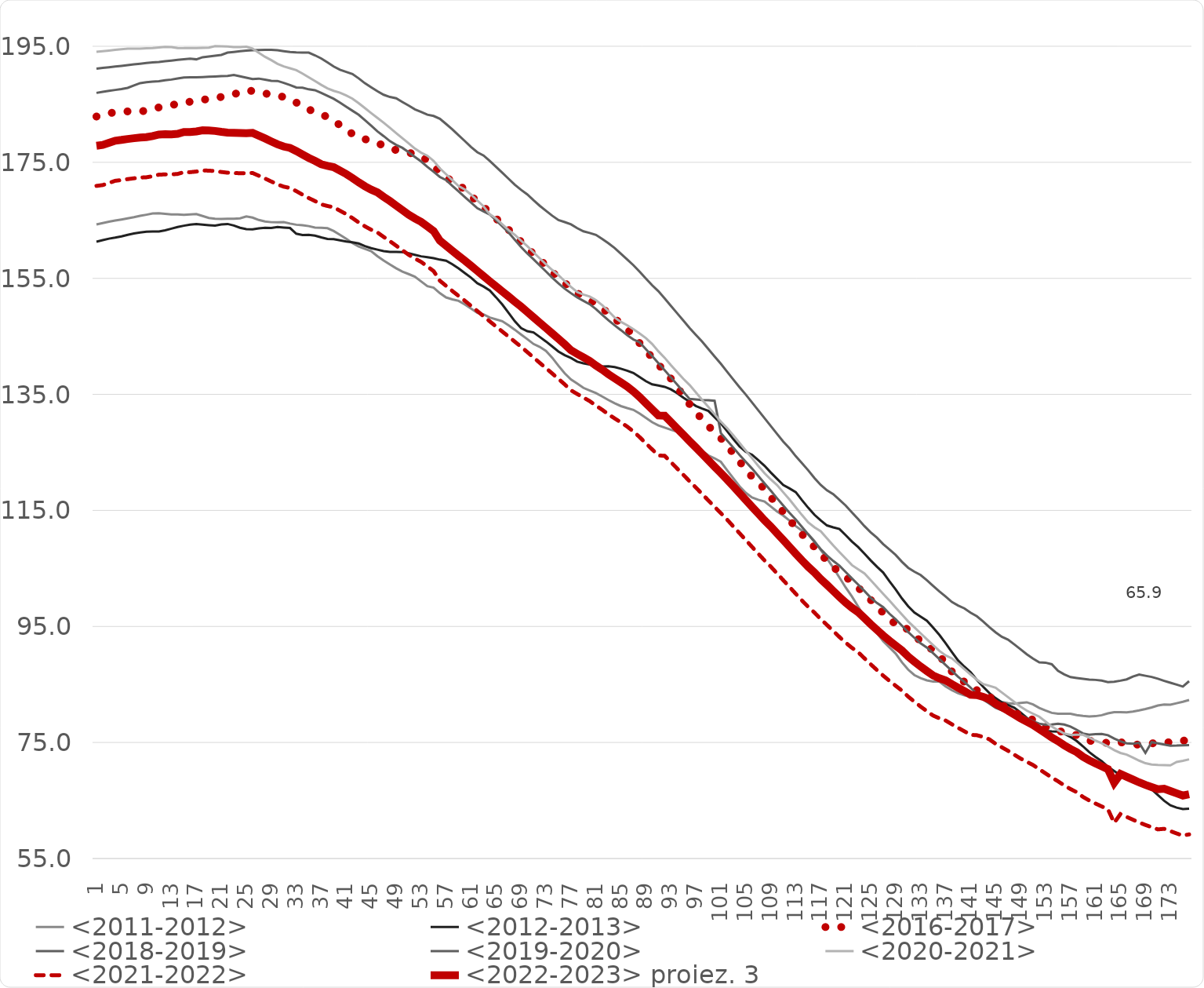
| Category | <2011-2012> | <2012-2013> | <2016-2017> | <2018-2019> | <2019-2020> | <2020-2021> | <2021-2022> | <2022-2023> proiez. 3 |
|---|---|---|---|---|---|---|---|---|
| 1.0 | 164.28 | 161.325 | 182.89 | 186.966 | 191.146 | 194.044 | 170.933 | 177.846 |
| 2.0 | 164.523 | 161.574 | 183.183 | 187.153 | 191.28 | 194.151 | 171.078 | 177.992 |
| 3.0 | 164.768 | 161.839 | 183.434 | 187.307 | 191.392 | 194.264 | 171.438 | 178.352 |
| 4.0 | 164.958 | 162.014 | 183.638 | 187.474 | 191.501 | 194.377 | 171.813 | 178.727 |
| 5.0 | 165.149 | 162.228 | 183.717 | 187.626 | 191.621 | 194.494 | 171.944 | 178.858 |
| 6.0 | 165.348 | 162.505 | 183.777 | 187.833 | 191.754 | 194.574 | 172.102 | 179.016 |
| 7.0 | 165.545 | 162.725 | 183.762 | 188.248 | 191.89 | 194.576 | 172.243 | 179.157 |
| 8.0 | 165.768 | 162.892 | 183.729 | 188.643 | 192 | 194.606 | 172.367 | 179.281 |
| 9.0 | 165.968 | 163.041 | 183.946 | 188.816 | 192.115 | 194.661 | 172.42 | 179.334 |
| 10.0 | 166.179 | 163.072 | 184.252 | 188.909 | 192.208 | 194.707 | 172.601 | 179.515 |
| 11.0 | 166.21 | 163.081 | 184.461 | 188.983 | 192.298 | 194.791 | 172.871 | 179.785 |
| 12.0 | 166.105 | 163.273 | 184.693 | 189.134 | 192.412 | 194.88 | 172.916 | 179.83 |
| 13.0 | 166.006 | 163.557 | 184.886 | 189.262 | 192.533 | 194.863 | 172.911 | 179.825 |
| 14.0 | 166.005 | 163.846 | 185.021 | 189.452 | 192.666 | 194.698 | 172.997 | 179.911 |
| 15.0 | 165.96 | 164.072 | 185.181 | 189.617 | 192.762 | 194.674 | 173.305 | 180.219 |
| 16.0 | 166.032 | 164.247 | 185.448 | 189.659 | 192.877 | 194.675 | 173.301 | 180.215 |
| 17.0 | 166.08 | 164.347 | 185.707 | 189.659 | 192.749 | 194.69 | 173.409 | 180.322 |
| 18.0 | 165.748 | 164.248 | 185.811 | 189.694 | 193.116 | 194.725 | 173.6 | 180.514 |
| 19.0 | 165.401 | 164.161 | 185.869 | 189.741 | 193.241 | 194.762 | 173.563 | 180.477 |
| 20.0 | 165.276 | 164.094 | 186.018 | 189.785 | 193.375 | 195.014 | 173.49 | 180.404 |
| 21.0 | 165.24 | 164.282 | 186.276 | 189.839 | 193.51 | 194.983 | 173.335 | 180.249 |
| 22.0 | 165.259 | 164.372 | 186.39 | 189.89 | 193.906 | 194.946 | 173.207 | 180.121 |
| 23.0 | 165.278 | 164.101 | 186.736 | 190.044 | 194.019 | 194.876 | 173.155 | 180.069 |
| 24.0 | 165.334 | 163.72 | 187.044 | 189.81 | 194.139 | 194.875 | 173.121 | 180.035 |
| 25.0 | 165.681 | 163.473 | 187.403 | 189.578 | 194.251 | 194.927 | 173.108 | 180.022 |
| 26.0 | 165.472 | 163.458 | 187.287 | 189.344 | 194.304 | 194.594 | 173.16 | 180.074 |
| 27.0 | 165.06 | 163.628 | 187.195 | 189.431 | 194.346 | 193.894 | 172.685 | 179.599 |
| 28.0 | 164.8 | 163.709 | 186.89 | 189.239 | 194.395 | 193.186 | 172.202 | 179.116 |
| 29.0 | 164.68 | 163.679 | 186.606 | 189.053 | 194.382 | 192.605 | 171.691 | 178.605 |
| 30.0 | 164.662 | 163.84 | 186.442 | 189.021 | 194.306 | 191.974 | 171.193 | 178.107 |
| 31.0 | 164.696 | 163.753 | 186.273 | 188.699 | 194.157 | 191.521 | 170.798 | 177.712 |
| 32.0 | 164.442 | 163.674 | 185.771 | 188.309 | 194.023 | 191.207 | 170.576 | 177.49 |
| 33.0 | 164.24 | 162.689 | 185.302 | 187.895 | 193.942 | 190.887 | 170.035 | 176.949 |
| 34.0 | 164.159 | 162.475 | 184.726 | 187.86 | 193.903 | 190.303 | 169.423 | 176.337 |
| 35.0 | 164.002 | 162.482 | 184.146 | 187.577 | 193.897 | 189.646 | 168.84 | 175.753 |
| 36.0 | 163.765 | 162.363 | 183.583 | 187.423 | 193.438 | 189.003 | 168.324 | 175.237 |
| 37.0 | 163.701 | 162.056 | 183.211 | 186.962 | 192.899 | 188.35 | 167.755 | 174.669 |
| 38.0 | 163.642 | 161.787 | 182.843 | 186.45 | 192.214 | 187.744 | 167.47 | 174.384 |
| 39.0 | 163.148 | 161.744 | 182.125 | 185.941 | 191.507 | 187.32 | 167.248 | 174.162 |
| 40.0 | 162.507 | 161.55 | 181.415 | 185.28 | 190.949 | 187.009 | 166.657 | 173.57 |
| 41.0 | 161.822 | 161.341 | 180.646 | 184.568 | 190.579 | 186.522 | 166.07 | 172.984 |
| 42.0 | 161.073 | 161.212 | 179.88 | 183.888 | 190.211 | 185.963 | 165.386 | 172.3 |
| 43.0 | 160.49 | 161.002 | 179.277 | 183.19 | 189.465 | 185.195 | 164.635 | 171.549 |
| 44.0 | 160.07 | 160.555 | 178.976 | 182.258 | 188.629 | 184.34 | 163.963 | 170.877 |
| 45.0 | 159.669 | 160.195 | 178.774 | 181.303 | 187.926 | 183.485 | 163.377 | 170.291 |
| 46.0 | 158.816 | 159.941 | 178.288 | 180.341 | 187.252 | 182.661 | 162.91 | 169.824 |
| 47.0 | 158.058 | 159.703 | 177.902 | 179.514 | 186.639 | 181.825 | 162.14 | 169.054 |
| 48.0 | 157.385 | 159.564 | 177.493 | 178.645 | 186.262 | 180.936 | 161.408 | 168.322 |
| 49.0 | 156.729 | 159.558 | 177.1 | 178.012 | 186.032 | 180.042 | 160.629 | 167.543 |
| 50.0 | 156.154 | 159.525 | 176.803 | 177.492 | 185.393 | 179.156 | 159.848 | 166.761 |
| 51.0 | 155.738 | 159.333 | 176.634 | 176.728 | 184.775 | 178.262 | 159.065 | 165.979 |
| 52.0 | 155.297 | 159.06 | 176.458 | 175.923 | 184.128 | 177.368 | 158.416 | 165.33 |
| 53.0 | 154.462 | 158.796 | 176.08 | 175.14 | 183.698 | 176.654 | 157.835 | 164.749 |
| 54.0 | 153.648 | 158.656 | 175.319 | 174.218 | 183.211 | 176.136 | 157.044 | 163.958 |
| 55.0 | 153.394 | 158.472 | 174.332 | 173.363 | 182.986 | 175.252 | 156.245 | 163.159 |
| 56.0 | 152.44 | 158.224 | 173.32 | 172.474 | 182.497 | 173.957 | 154.587 | 161.501 |
| 57.0 | 151.708 | 158.039 | 172.376 | 171.93 | 181.602 | 172.946 | 153.699 | 160.613 |
| 58.0 | 151.371 | 157.429 | 171.735 | 170.924 | 180.675 | 171.925 | 152.817 | 159.731 |
| 59.0 | 151.118 | 156.706 | 171.193 | 169.997 | 179.667 | 170.903 | 151.973 | 158.887 |
| 60.0 | 150.496 | 155.915 | 170.25 | 169.017 | 178.66 | 170.308 | 151.138 | 158.052 |
| 61.0 | 149.787 | 155.105 | 169.221 | 168.064 | 177.642 | 169.436 | 150.25 | 157.164 |
| 62.0 | 149.055 | 154.155 | 168.177 | 167.082 | 176.739 | 168.419 | 149.364 | 156.278 |
| 63.0 | 148.783 | 153.588 | 167.304 | 166.532 | 176.172 | 167.404 | 148.472 | 155.386 |
| 64.0 | 148.249 | 152.91 | 166.292 | 165.994 | 175.228 | 166.036 | 147.575 | 154.489 |
| 65.0 | 147.932 | 151.729 | 165.29 | 165.006 | 174.224 | 165.324 | 146.7 | 153.614 |
| 66.0 | 147.606 | 150.491 | 164.434 | 163.952 | 173.213 | 164.317 | 145.825 | 152.739 |
| 67.0 | 146.904 | 149.047 | 163.392 | 162.9 | 172.168 | 163.33 | 144.964 | 151.878 |
| 68.0 | 146.144 | 147.613 | 162.358 | 161.656 | 171.148 | 162.506 | 144.086 | 151 |
| 69.0 | 145.326 | 146.426 | 161.311 | 160.407 | 170.258 | 161.497 | 143.221 | 150.135 |
| 70.0 | 144.531 | 145.887 | 160.264 | 159.286 | 169.468 | 160.545 | 142.289 | 149.203 |
| 71.0 | 143.686 | 145.68 | 159.179 | 158.28 | 168.461 | 159.487 | 141.365 | 148.278 |
| 72.0 | 143.184 | 144.9 | 158.19 | 157.221 | 167.504 | 158.441 | 140.428 | 147.341 |
| 73.0 | 142.495 | 144.112 | 157.227 | 156.174 | 166.634 | 157.403 | 139.519 | 146.433 |
| 74.0 | 141.311 | 143.253 | 156.112 | 155.108 | 165.794 | 156.446 | 138.598 | 145.512 |
| 75.0 | 139.927 | 142.39 | 155.035 | 154.122 | 165.038 | 155.558 | 137.659 | 144.572 |
| 76.0 | 138.616 | 141.749 | 154.21 | 153.221 | 164.7 | 154.524 | 136.716 | 143.63 |
| 77.0 | 137.564 | 141.277 | 153.305 | 152.44 | 164.302 | 153.52 | 135.7 | 142.614 |
| 78.0 | 136.869 | 140.637 | 152.461 | 151.705 | 163.651 | 152.633 | 135.062 | 141.976 |
| 79.0 | 136.122 | 140.352 | 151.76 | 151.12 | 163.099 | 152.212 | 134.454 | 141.368 |
| 80.0 | 135.659 | 140.131 | 151.224 | 150.539 | 162.824 | 151.868 | 133.837 | 140.751 |
| 81.0 | 135.215 | 140.011 | 150.686 | 149.706 | 162.484 | 151.233 | 133.06 | 139.973 |
| 82.0 | 134.636 | 139.82 | 149.846 | 148.728 | 161.795 | 150.365 | 132.347 | 139.261 |
| 83.0 | 134.026 | 139.827 | 148.965 | 147.769 | 161.038 | 149.346 | 131.557 | 138.471 |
| 84.0 | 133.464 | 139.696 | 148.096 | 146.891 | 160.215 | 148.244 | 130.854 | 137.768 |
| 85.0 | 132.98 | 139.419 | 147.134 | 146.071 | 159.236 | 147.5 | 130.162 | 137.075 |
| 86.0 | 132.64 | 139.079 | 146.28 | 145.196 | 158.247 | 146.909 | 129.45 | 136.363 |
| 87.0 | 132.33 | 138.688 | 145.083 | 144.462 | 157.264 | 146.22 | 128.603 | 135.516 |
| 88.0 | 131.681 | 137.967 | 143.819 | 143.982 | 156.144 | 145.488 | 127.629 | 134.543 |
| 89.0 | 130.959 | 137.276 | 142.535 | 142.797 | 154.962 | 144.704 | 126.552 | 133.466 |
| 90.0 | 130.205 | 136.724 | 141.357 | 141.587 | 153.801 | 143.691 | 125.514 | 132.428 |
| 91.0 | 129.646 | 136.519 | 140.121 | 140.373 | 152.783 | 142.426 | 124.47 | 131.384 |
| 92.0 | 129.268 | 136.297 | 138.984 | 139.158 | 151.54 | 141.31 | 124.41 | 131.323 |
| 93.0 | 128.901 | 135.872 | 137.714 | 137.932 | 150.269 | 140.043 | 123.327 | 130.241 |
| 94.0 | 128.59 | 135.206 | 136.264 | 136.684 | 148.989 | 138.85 | 122.224 | 129.138 |
| 95.0 | 127.781 | 134.426 | 134.78 | 135.436 | 147.711 | 137.667 | 121.129 | 128.043 |
| 96.0 | 126.947 | 133.724 | 133.304 | 134.213 | 146.43 | 136.613 | 120.019 | 126.933 |
| 97.0 | 126.146 | 132.997 | 131.943 | 134.116 | 145.25 | 135.341 | 118.944 | 125.858 |
| 98.0 | 125.26 | 132.563 | 130.715 | 134.042 | 144.095 | 134.071 | 117.832 | 124.746 |
| 99.0 | 124.481 | 132.156 | 129.536 | 133.992 | 142.825 | 132.838 | 116.724 | 123.638 |
| 100.0 | 123.978 | 131.066 | 128.514 | 133.898 | 141.542 | 131.573 | 115.612 | 122.526 |
| 101.0 | 123.371 | 129.99 | 127.447 | 128.326 | 140.272 | 130.308 | 114.538 | 121.452 |
| 102.0 | 121.942 | 128.678 | 126.269 | 127.056 | 138.918 | 129.185 | 113.414 | 120.328 |
| 103.0 | 120.548 | 127.289 | 124.79 | 125.826 | 137.56 | 127.96 | 112.235 | 119.149 |
| 104.0 | 119.158 | 126.034 | 123.45 | 124.551 | 136.229 | 126.62 | 111.066 | 117.98 |
| 105.0 | 118.024 | 125.088 | 122.039 | 123.387 | 134.953 | 125.311 | 109.89 | 116.804 |
| 106.0 | 117.22 | 124.596 | 120.786 | 122.209 | 133.597 | 123.998 | 108.709 | 115.623 |
| 107.0 | 116.828 | 123.647 | 119.751 | 120.946 | 132.242 | 122.658 | 107.535 | 114.449 |
| 108.0 | 116.537 | 122.696 | 118.698 | 119.665 | 130.905 | 121.416 | 106.374 | 113.288 |
| 109.0 | 115.679 | 121.535 | 117.288 | 118.395 | 129.553 | 120.334 | 105.306 | 112.22 |
| 110.0 | 114.825 | 120.446 | 116.044 | 117.106 | 128.189 | 119.375 | 104.146 | 111.06 |
| 111.0 | 114.112 | 119.39 | 114.753 | 115.823 | 126.855 | 118.113 | 102.969 | 109.883 |
| 112.0 | 113.241 | 118.797 | 113.401 | 114.577 | 125.695 | 116.871 | 101.806 | 108.72 |
| 113.0 | 112.302 | 118.155 | 112.06 | 113.423 | 124.346 | 115.531 | 100.629 | 107.543 |
| 114.0 | 111.5 | 116.77 | 110.897 | 112.137 | 123.15 | 114.198 | 99.469 | 106.383 |
| 115.0 | 110.894 | 115.448 | 109.837 | 110.875 | 121.904 | 112.944 | 98.365 | 105.279 |
| 116.0 | 109.73 | 114.241 | 108.664 | 109.587 | 120.565 | 112.082 | 97.384 | 104.297 |
| 117.0 | 108.188 | 113.268 | 107.456 | 108.318 | 119.396 | 111.411 | 96.259 | 103.173 |
| 118.0 | 106.711 | 112.411 | 106.353 | 107.228 | 118.46 | 110.19 | 95.256 | 102.169 |
| 119.0 | 105.132 | 112.08 | 105.28 | 106.291 | 117.798 | 108.964 | 94.214 | 101.128 |
| 120.0 | 103.42 | 111.801 | 104.305 | 105.469 | 116.821 | 107.831 | 93.178 | 100.092 |
| 121.0 | 101.706 | 110.732 | 103.5 | 104.371 | 115.839 | 106.702 | 92.19 | 99.104 |
| 122.0 | 100.163 | 109.634 | 102.744 | 103.272 | 114.636 | 105.569 | 91.314 | 98.228 |
| 123.0 | 98.419 | 108.676 | 101.681 | 102.215 | 113.498 | 104.854 | 90.544 | 97.458 |
| 124.0 | 96.634 | 107.558 | 100.651 | 101.106 | 112.299 | 104.141 | 89.513 | 96.427 |
| 125.0 | 95.161 | 106.385 | 99.582 | 99.964 | 111.218 | 102.984 | 88.476 | 95.39 |
| 126.0 | 93.878 | 105.309 | 98.473 | 99.057 | 110.292 | 101.784 | 87.49 | 94.403 |
| 127.0 | 92.453 | 104.288 | 97.332 | 98.329 | 109.201 | 100.609 | 86.522 | 93.436 |
| 128.0 | 91.396 | 102.788 | 96.237 | 97.198 | 108.275 | 99.46 | 85.626 | 92.54 |
| 129.0 | 90.328 | 101.374 | 95.416 | 96.255 | 107.33 | 98.249 | 84.77 | 91.684 |
| 130.0 | 88.823 | 99.838 | 95.401 | 95.142 | 106.149 | 97.051 | 83.946 | 90.86 |
| 131.0 | 87.559 | 98.495 | 94.34 | 94.03 | 105.12 | 95.868 | 82.911 | 89.825 |
| 132.0 | 86.621 | 97.4 | 93.37 | 93.044 | 104.443 | 94.844 | 82.035 | 88.949 |
| 133.0 | 86.094 | 96.704 | 92.499 | 92.091 | 103.864 | 93.818 | 81.181 | 88.095 |
| 134.0 | 85.708 | 95.982 | 91.582 | 91.352 | 102.964 | 92.793 | 80.402 | 87.316 |
| 135.0 | 85.493 | 94.792 | 90.928 | 90.386 | 101.992 | 91.767 | 79.639 | 86.553 |
| 136.0 | 85.492 | 93.544 | 90.273 | 89.382 | 101.04 | 90.783 | 79.162 | 86.076 |
| 137.0 | 84.663 | 92.111 | 88.236 | 88.35 | 100.156 | 90.009 | 78.788 | 85.702 |
| 138.0 | 84.01 | 90.598 | 87.235 | 87.351 | 99.22 | 89.504 | 78.14 | 85.054 |
| 139.0 | 83.504 | 89.135 | 86.347 | 86.335 | 98.613 | 88.587 | 77.528 | 84.442 |
| 140.0 | 83.13 | 88.077 | 85.439 | 85.453 | 98.115 | 87.634 | 76.935 | 83.849 |
| 141.0 | 82.929 | 87.119 | 84.504 | 84.451 | 97.381 | 86.72 | 76.321 | 83.234 |
| 142.0 | 82.999 | 85.819 | 84.01 | 83.378 | 96.752 | 85.835 | 76.254 | 83.168 |
| 143.0 | 83.099 | 84.631 | 83.658 | 82.412 | 95.871 | 85.064 | 75.96 | 82.874 |
| 144.0 | 82.843 | 83.519 | 82.895 | 81.7 | 94.883 | 84.77 | 75.546 | 82.46 |
| 145.0 | 82.396 | 82.649 | 82.074 | 80.993 | 93.991 | 84.449 | 74.779 | 81.693 |
| 146.0 | 81.971 | 81.905 | 81.471 | 80.567 | 93.221 | 83.626 | 74.172 | 81.086 |
| 147.0 | 81.79 | 81.46 | 80.798 | 80.335 | 92.734 | 82.807 | 73.564 | 80.478 |
| 148.0 | 81.696 | 80.99 | 80.109 | 80.162 | 91.907 | 81.993 | 72.896 | 79.81 |
| 149.0 | 81.813 | 80.18 | 79.725 | 79.665 | 91.055 | 81.173 | 72.236 | 79.15 |
| 150.0 | 81.924 | 79.264 | 79.42 | 79.19 | 90.202 | 80.49 | 71.677 | 78.59 |
| 151.0 | 81.556 | 78.197 | 78.875 | 78.648 | 89.46 | 79.959 | 71.113 | 78.027 |
| 152.0 | 80.955 | 77.449 | 78.25 | 78.246 | 88.822 | 79.446 | 70.396 | 77.31 |
| 153.0 | 80.508 | 76.972 | 77.684 | 78.078 | 88.764 | 78.597 | 69.676 | 76.59 |
| 154.0 | 80.109 | 76.916 | 77.235 | 78.092 | 88.487 | 77.754 | 68.959 | 75.873 |
| 155.0 | 79.942 | 76.89 | 76.931 | 78.223 | 87.348 | 77.125 | 68.318 | 75.231 |
| 156.0 | 79.942 | 76.503 | 76.843 | 78.1 | 86.73 | 76.536 | 67.6 | 74.514 |
| 157.0 | 79.942 | 75.956 | 76.758 | 77.746 | 86.269 | 76.318 | 66.974 | 73.887 |
| 158.0 | 79.711 | 75.247 | 76.226 | 77.179 | 86.117 | 76.322 | 66.428 | 73.342 |
| 159.0 | 79.573 | 74.341 | 75.738 | 76.555 | 85.987 | 76.331 | 65.624 | 72.538 |
| 160.0 | 79.491 | 73.348 | 75.342 | 76.348 | 85.853 | 75.852 | 65.002 | 71.916 |
| 161.0 | 79.534 | 72.522 | 75.069 | 76.428 | 85.789 | 75.326 | 64.481 | 71.395 |
| 162.0 | 79.704 | 71.79 | 74.843 | 76.482 | 85.656 | 74.853 | 63.977 | 70.891 |
| 163.0 | 80.014 | 70.82 | 74.991 | 76.261 | 85.403 | 74.314 | 63.49 | 70.404 |
| 164.0 | 80.225 | 70.071 | 75.182 | 75.678 | 85.46 | 73.68 | 61.152 | 68.065 |
| 165.0 | 80.225 | 69.337 | 75.043 | 75.2 | 85.652 | 73.195 | 62.66 | 69.574 |
| 166.0 | 80.198 | 68.909 | 74.87 | 74.848 | 85.878 | 72.916 | 62.172 | 69.086 |
| 167.0 | 80.332 | 68.573 | 74.707 | 74.783 | 86.356 | 72.395 | 61.689 | 68.603 |
| 168.0 | 80.534 | 68.148 | 74.602 | 74.935 | 86.702 | 71.872 | 61.212 | 68.126 |
| 169.0 | 80.765 | 67.783 | 74.576 | 73.199 | 86.5 | 71.431 | 60.787 | 67.701 |
| 170.0 | 81.037 | 66.933 | 74.808 | 75.064 | 86.3 | 71.201 | 60.402 | 67.315 |
| 171.0 | 81.371 | 65.937 | 75.092 | 74.856 | 85.985 | 71.135 | 60.022 | 66.936 |
| 172.0 | 81.535 | 64.963 | 75.086 | 74.638 | 85.629 | 71.096 | 60.119 | 67.033 |
| 173.0 | 81.505 | 64.177 | 75.005 | 74.442 | 85.298 | 71.057 | 59.724 | 66.638 |
| 174.0 | 81.77 | 63.776 | 75.069 | 74.464 | 84.972 | 71.632 | 59.321 | 66.235 |
| 175.0 | 82.019 | 63.516 | 75.253 | 74.51 | 84.646 | 71.85 | 58.945 | 65.859 |
| 176.0 | 82.326 | 63.591 | 75.645 | 74.557 | 85.57 | 72.098 | 59.16 | 66.074 |